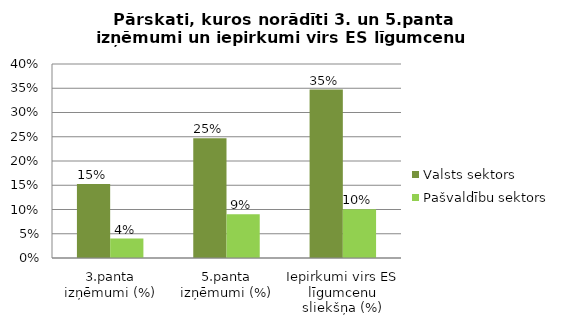
| Category | Valsts sektors | Pašvaldību sektors |
|---|---|---|
| 3.panta izņēmumi (%) | 0.153 | 0.04 |
| 5.panta izņēmumi (%) | 0.247 | 0.09 |
| Iepirkumi virs ES līgumcenu sliekšņa (%) | 0.347 | 0.101 |